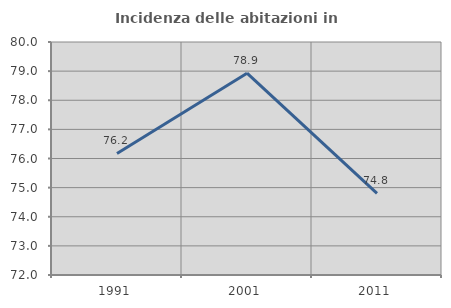
| Category | Incidenza delle abitazioni in proprietà  |
|---|---|
| 1991.0 | 76.174 |
| 2001.0 | 78.929 |
| 2011.0 | 74.8 |